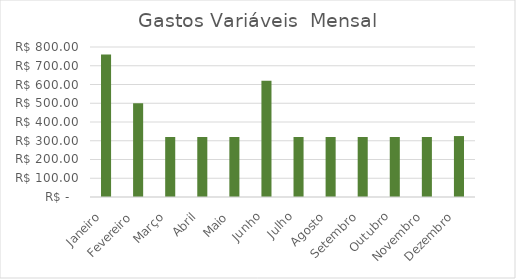
| Category | Gastos Variáveis |
|---|---|
| Janeiro | 760 |
| Fevereiro | 500 |
| Março | 320 |
| Abril | 320 |
| Maio | 320 |
| Junho | 620 |
| Julho | 320 |
| Agosto | 320 |
| Setembro | 320 |
| Outubro | 320 |
| Novembro | 320 |
| Dezembro | 325 |